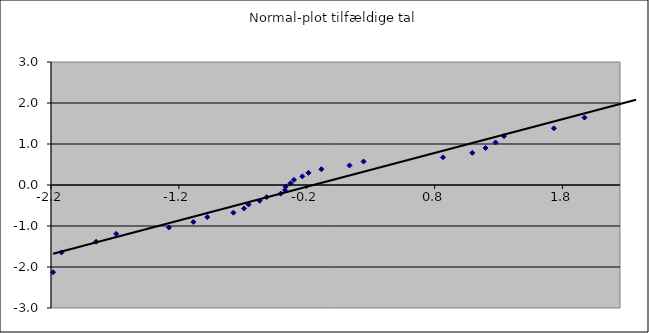
| Category | Fraktil |
|---|---|
| -2.183587639592588 | -2.128 |
| -2.1179312170716003 | -1.645 |
| -1.8469108908902854 | -1.383 |
| -1.690432327450253 | -1.192 |
| -1.2776831681549083 | -1.036 |
| -1.0867006494663656 | -0.903 |
| -0.9776294973562472 | -0.784 |
| -0.77350705396384 | -0.674 |
| -0.6902041604917031 | -0.573 |
| -0.6549066711158957 | -0.477 |
| -0.5679248715750873 | -0.385 |
| -0.5132073965796735 | -0.297 |
| -0.40404756873613223 | -0.21 |
| -0.3702405138028553 | -0.126 |
| -0.3654929514596006 | -0.042 |
| -0.3269906301284209 | 0.042 |
| -0.3002321591338841 | 0.126 |
| -0.23418124328600243 | 0.21 |
| -0.18615764929563738 | 0.297 |
| -0.0852844550536247 | 0.385 |
| 0.1348530531686265 | 0.477 |
| 0.24425730771326926 | 0.573 |
| 0.8656729733047541 | 0.674 |
| 1.0950225259875879 | 0.784 |
| 1.1983502190560102 | 0.903 |
| 1.2764735402015503 | 1.036 |
| 1.3426415534922853 | 1.192 |
| 1.733133103698492 | 1.383 |
| 1.9722119759535417 | 1.645 |
| 2.375654730712995 | 2.128 |